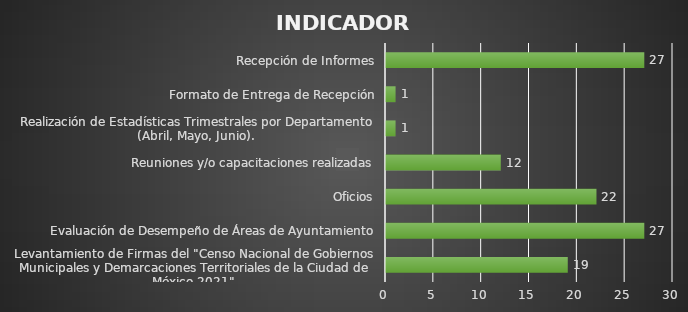
| Category | INDICADOR  |
|---|---|
| Levantamiento de Firmas del "Censo Nacional de Gobiernos Municipales y Demarcaciones Territoriales de la Ciudad de México 2021". | 19 |
| Evaluación de Desempeño de Áreas de Ayuntamiento | 27 |
| Oficios | 22 |
| Reuniones y/o capacitaciones realizadas | 12 |
| Realización de Estadísticas Trimestrales por Departamento (Abril, Mayo, Junio).  | 1 |
| Formato de Entrega de Recepción | 1 |
| Recepción de Informes | 27 |